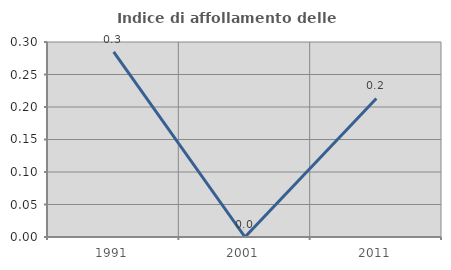
| Category | Indice di affollamento delle abitazioni  |
|---|---|
| 1991.0 | 0.285 |
| 2001.0 | 0 |
| 2011.0 | 0.213 |